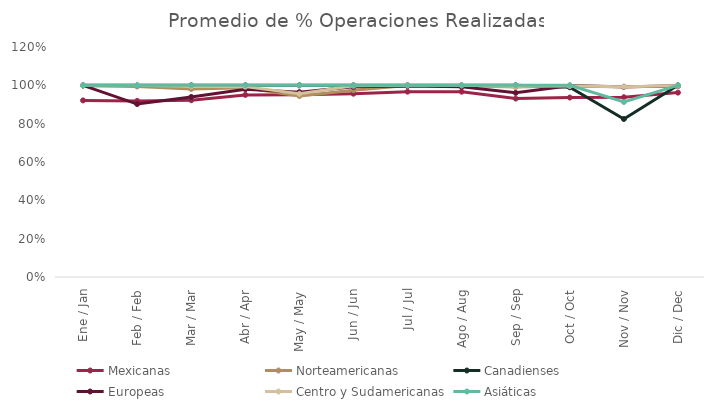
| Category | Mexicanas | Norteamericanas | Canadienses | Europeas | Centro y Sudamericanas | Asiáticas |
|---|---|---|---|---|---|---|
| Ene / Jan | 0.921 | 0.998 | 1 | 1 | 1 | 1 |
| Feb / Feb | 0.919 | 0.994 | 1 | 0.902 | 1 | 1 |
| Mar / Mar | 0.922 | 0.981 | 1 | 0.939 | 0.995 | 1 |
| Abr / Apr | 0.95 | 0.987 | 1 | 0.98 | 0.993 | 1 |
| May / May | 0.951 | 0.944 | 1 | 0.964 | 0.956 | 1 |
| Jun / Jun | 0.957 | 0.975 | 1 | 0.992 | 0.998 | 1 |
| Jul / Jul | 0.967 | 0.999 | 1 | 0.996 | 1 | 1 |
| Ago / Aug | 0.967 | 0.998 | 1 | 0.992 | 1 | 1 |
| Sep / Sep | 0.931 | 0.991 | 1 | 0.961 | 0.995 | 1 |
| Oct / Oct | 0.936 | 0.998 | 0.99 | 0.998 | 0.996 | 1 |
| Nov / Nov | 0.938 | 0.992 | 0.824 | 0.992 | 0.993 | 0.913 |
| Dic / Dec | 0.962 | 0.998 | 1 | 0.996 | 0.998 | 1 |